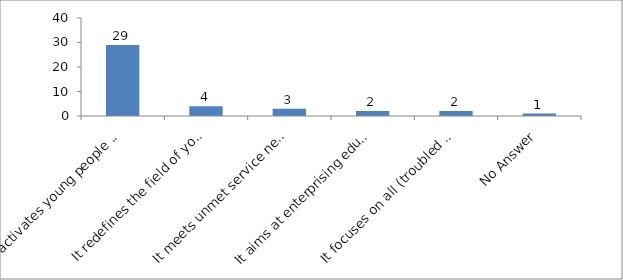
| Category | What did you like the most about the concept of Youth-led Changemaking? |
|---|---|
| It activates young people as changemakers | 29 |
| It redefines the field of youth development | 4 |
| It meets unmet service needs of the society | 3 |
| It aims at enterprising education | 2 |
| It focuses on all (troubled and prepared) young people | 2 |
| No Answer | 1 |